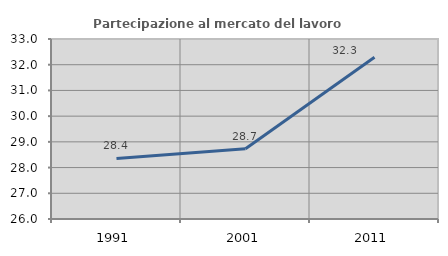
| Category | Partecipazione al mercato del lavoro  femminile |
|---|---|
| 1991.0 | 28.354 |
| 2001.0 | 28.734 |
| 2011.0 | 32.293 |